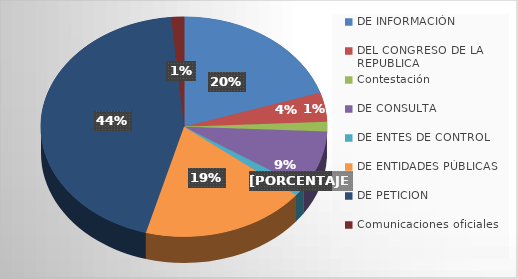
| Category | Series 0 |
|---|---|
| DE INFORMACIÓN | 14 |
| DEL CONGRESO DE LA REPUBLICA | 3 |
| Contestación | 1 |
| DE CONSULTA | 6 |
| DE ENTES DE CONTROL | 1 |
| DE ENTIDADES PÚBLICAS | 13 |
| DE PETICION | 31 |
| Comunicaciones oficiales | 1 |